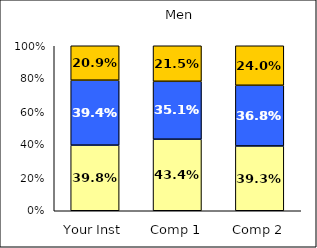
| Category | Low Civic Engagement | Average Civic Engagement | High Civic Engagement |
|---|---|---|---|
| Your Inst | 0.398 | 0.394 | 0.209 |
| Comp 1 | 0.434 | 0.351 | 0.215 |
| Comp 2 | 0.393 | 0.368 | 0.24 |